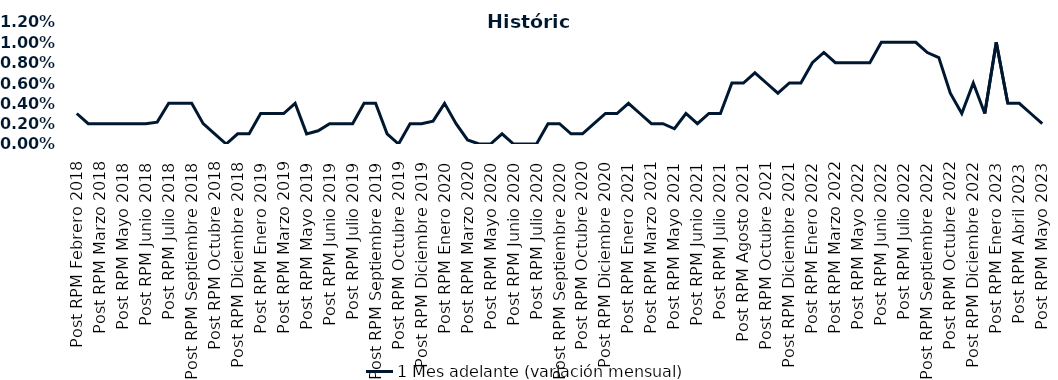
| Category | 1 Mes adelante (variación mensual) |
|---|---|
| Post RPM Febrero 2018 | 0.003 |
| Pre RPM Marzo 2018 | 0.002 |
| Post RPM Marzo 2018 | 0.002 |
| Pre RPM Mayo 2018 | 0.002 |
| Post RPM Mayo 2018 | 0.002 |
| Pre RPM Junio 2018 | 0.002 |
| Post RPM Junio 2018 | 0.002 |
| Pre RPM Julio 2018 | 0.002 |
| Post RPM Julio 2018 | 0.004 |
| Pre RPM Septiembre 2018 | 0.004 |
| Post RPM Septiembre 2018 | 0.004 |
| Pre RPM Octubre 2018 | 0.002 |
| Post RPM Octubre 2018 | 0.001 |
| Pre RPM Diciembre 2018 | 0 |
| Post RPM Diciembre 2018 | 0.001 |
| Pre RPM Enero 2019 | 0.001 |
| Post RPM Enero 2019 | 0.003 |
| Pre RPM Marzo 2019 | 0.003 |
| Post RPM Marzo 2019 | 0.003 |
| Pre RPM Mayo 2019 | 0.004 |
| Post RPM Mayo 2019 | 0.001 |
| Pre RPM Junio 2019 | 0.001 |
| Post RPM Junio 2019 | 0.002 |
| Pre RPM Julio 2019 | 0.002 |
| Post RPM Julio 2019 | 0.002 |
| Pre RPM Septiembre 2019 | 0.004 |
| Post RPM Septiembre 2019 | 0.004 |
| Pre RPM Octubre 2019 | 0.001 |
| Post RPM Octubre 2019 | 0 |
| Pre RPM Diciembre 2019 | 0.002 |
| Post RPM Diciembre 2019 | 0.002 |
| Pre RPM Enero 2020 | 0.002 |
| Post RPM Enero 2020 | 0.004 |
| Pre RPM Marzo 2020 | 0.002 |
| Post RPM Marzo 2020 | 0 |
| Pre RPM Mayo 2020 | 0 |
| Post RPM Mayo 2020 | 0 |
| Pre RPM Junio 2020 | 0.001 |
| Post RPM Junio 2020 | 0 |
| Pre RPM Julio 2020 | 0 |
| Post RPM Julio 2020 | 0 |
| Pre RPM Septiembre 2020 | 0.002 |
| Post RPM Septiembre 2020 | 0.002 |
| Pre RPM Octubre 2020 | 0.001 |
| Post RPM Octubre 2020 | 0.001 |
| Pre RPM Diciembre 2020 | 0.002 |
| Post RPM Diciembre 2020 | 0.003 |
| Pre RPM Enero 2021 | 0.003 |
| Post RPM Enero 2021 | 0.004 |
| Pre RPM Marzo 2021 | 0.003 |
| Post RPM Marzo 2021 | 0.002 |
| Pre RPM Mayo 2021 | 0.002 |
| Post RPM Mayo 2021 | 0.002 |
| Pre RPM Junio 2021 | 0.003 |
| Post RPM Junio 2021 | 0.002 |
| Pre RPM Julio 2021 | 0.003 |
| Post RPM Julio 2021 | 0.003 |
| Pre RPM Agosto 2021 | 0.006 |
| Post RPM Agosto 2021 | 0.006 |
| Pre RPM Octubre 2021 | 0.007 |
| Post RPM Octubre 2021 | 0.006 |
| Pre RPM Diciembre 2021 | 0.005 |
| Post RPM Diciembre 2021 | 0.006 |
| Pre RPM Enero 2022 | 0.006 |
| Post RPM Enero 2022 | 0.008 |
| Pre RPM Marzo 2022 | 0.009 |
| Post RPM Marzo 2022 | 0.008 |
| Pre RPM Mayo 2022 | 0.008 |
| Post RPM Mayo 2022 | 0.008 |
| Pre RPM Junio 2022 | 0.008 |
| Post RPM Junio 2022 | 0.01 |
| Pre RPM Julio 2022 | 0.01 |
| Post RPM Julio 2022 | 0.01 |
| Pre RPM Septiembre 2022 | 0.01 |
| Post RPM Septiembre 2022 | 0.009 |
| Pre RPM Octubre 2022 | 0.008 |
| Post RPM Octubre 2022 | 0.005 |
| Pre RPM Diciembre 2022 | 0.003 |
| Post RPM Diciembre 2022 | 0.006 |
| Pre RPM Enero 2023 | 0.003 |
| Post RPM Enero 2023 | 0.01 |
| Pre RPM Abril 2023 | 0.004 |
| Post RPM Abril 2023 | 0.004 |
| Pre RPM Mayo 2023 | 0.003 |
| Post RPM Mayo 2023 | 0.002 |